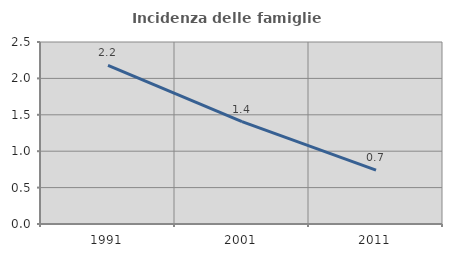
| Category | Incidenza delle famiglie numerose |
|---|---|
| 1991.0 | 2.178 |
| 2001.0 | 1.406 |
| 2011.0 | 0.74 |